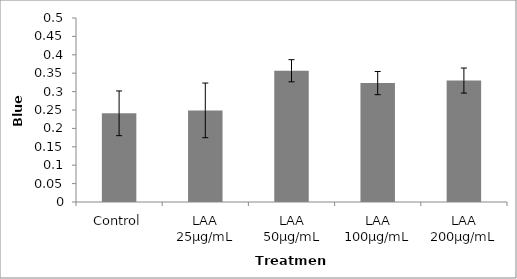
| Category | Series 0 |
|---|---|
| Control | 0.241 |
| LAA 25µg/mL | 0.249 |
| LAA 50µg/mL | 0.357 |
| LAA 100µg/mL | 0.323 |
| LAA 200µg/mL | 0.33 |